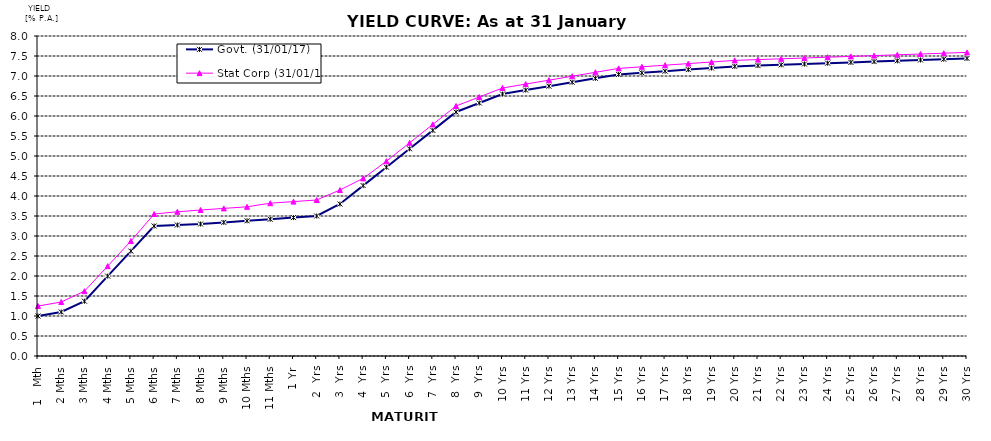
| Category | Govt. (31/01/17) | Stat Corp (31/01/17) |
|---|---|---|
| 1   Mth | 1 | 1.25 |
| 2 Mths | 1.1 | 1.35 |
| 3 Mths | 1.37 | 1.62 |
| 4 Mths | 1.997 | 2.247 |
| 5 Mths | 2.623 | 2.873 |
| 6 Mths | 3.25 | 3.55 |
| 7 Mths | 3.275 | 3.605 |
| 8 Mths | 3.3 | 3.65 |
| 9 Mths | 3.34 | 3.69 |
| 10 Mths | 3.38 | 3.73 |
| 11 Mths | 3.42 | 3.82 |
| 1 Yr | 3.46 | 3.86 |
| 2  Yrs | 3.5 | 3.9 |
| 3  Yrs | 3.8 | 4.15 |
| 4  Yrs | 4.26 | 4.44 |
| 5  Yrs | 4.72 | 4.87 |
| 6  Yrs | 5.18 | 5.33 |
| 7  Yrs | 5.64 | 5.79 |
| 8  Yrs | 6.1 | 6.25 |
| 9  Yrs | 6.325 | 6.475 |
| 10 Yrs | 6.55 | 6.7 |
| 11 Yrs | 6.648 | 6.798 |
| 12 Yrs | 6.746 | 6.896 |
| 13 Yrs | 6.844 | 6.994 |
| 14 Yrs | 6.942 | 7.092 |
| 15 Yrs | 7.04 | 7.19 |
| 16 Yrs | 7.08 | 7.23 |
| 17 Yrs | 7.12 | 7.27 |
| 18 Yrs | 7.16 | 7.31 |
| 19 Yrs | 7.2 | 7.35 |
| 20 Yrs | 7.24 | 7.39 |
| 21 Yrs | 7.26 | 7.41 |
| 22 Yrs | 7.28 | 7.43 |
| 23 Yrs | 7.3 | 7.45 |
| 24 Yrs | 7.32 | 7.47 |
| 25 Yrs | 7.34 | 7.49 |
| 26 Yrs | 7.36 | 7.51 |
| 27 Yrs | 7.38 | 7.53 |
| 28 Yrs | 7.4 | 7.55 |
| 29 Yrs | 7.42 | 7.57 |
| 30 Yrs | 7.44 | 7.59 |